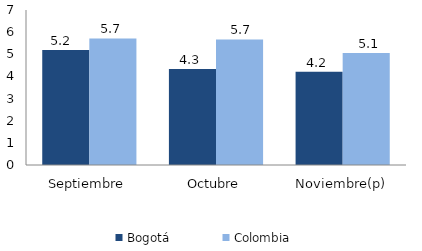
| Category | Bogotá | Colombia |
|---|---|---|
| Septiembre | 5.189 | 5.717 |
| Octubre | 4.341 | 5.668 |
| Noviembre(p) | 4.213 | 5.063 |